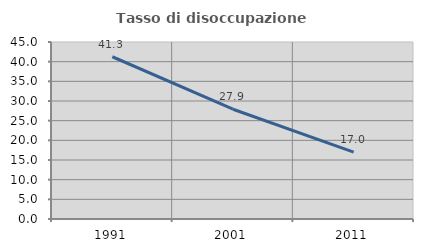
| Category | Tasso di disoccupazione giovanile  |
|---|---|
| 1991.0 | 41.25 |
| 2001.0 | 27.907 |
| 2011.0 | 17.021 |